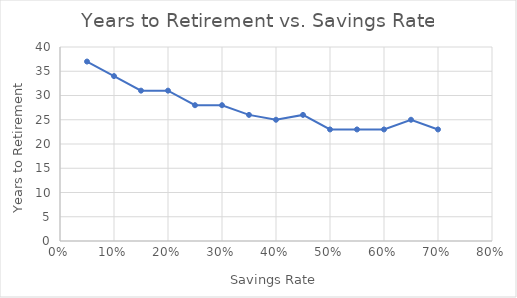
| Category | Series 0 |
|---|---|
| 0.05 | 37 |
| 0.1 | 34 |
| 0.15 | 31 |
| 0.2 | 31 |
| 0.25 | 28 |
| 0.3 | 28 |
| 0.35 | 26 |
| 0.4 | 25 |
| 0.45 | 26 |
| 0.5 | 23 |
| 0.55 | 23 |
| 0.6 | 23 |
| 0.65 | 25 |
| 0.7 | 23 |